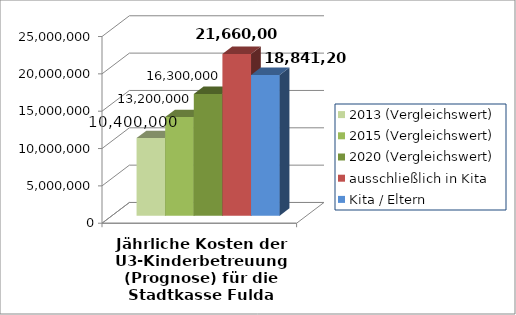
| Category | 2013 (Vergleichswert) | 2015 (Vergleichswert) | 2020 (Vergleichswert) | ausschließlich in Kita | Kita / Eltern |
|---|---|---|---|---|---|
| 0 | 10400000 | 13200000 | 16300000 | 21660000 | 18841200 |